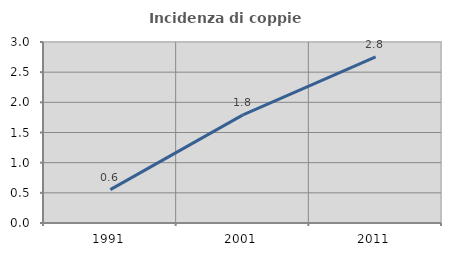
| Category | Incidenza di coppie miste |
|---|---|
| 1991.0 | 0.553 |
| 2001.0 | 1.792 |
| 2011.0 | 2.755 |